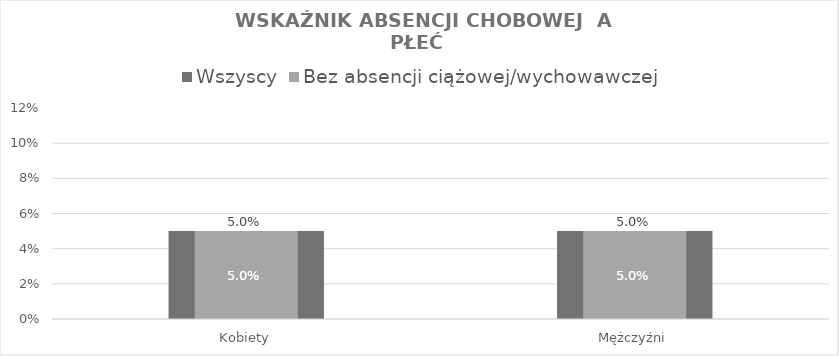
| Category | Wszyscy |
|---|---|
| Kobiety | 0.05 |
| Mężczyźni | 0.05 |